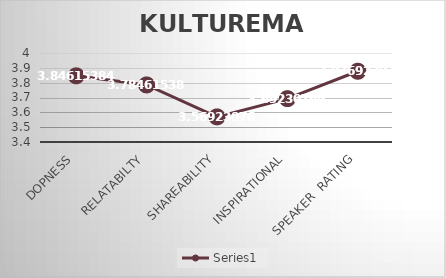
| Category | Series 0 |
|---|---|
| Dopness | 3.846 |
| Relatabilty | 3.785 |
| Shareability | 3.569 |
| Inspirational | 3.692 |
| Speaker  Rating | 3.877 |